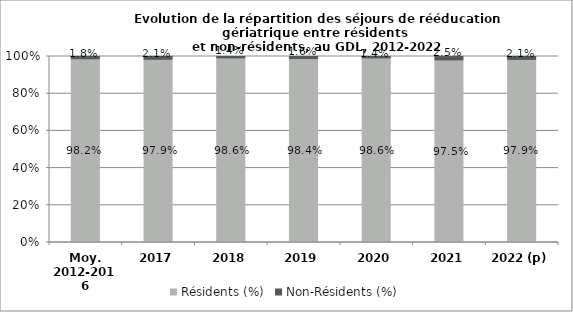
| Category | Résidents (%) | Non-Résidents (%) |
|---|---|---|
| Moy. 2012-2016 | 0.982 | 0.018 |
| 2017 | 0.979 | 0.021 |
| 2018 | 0.986 | 0.014 |
| 2019 | 0.984 | 0.016 |
| 2020 | 0.986 | 0.014 |
| 2021 | 0.975 | 0.025 |
| 2022 (p) | 0.979 | 0.021 |